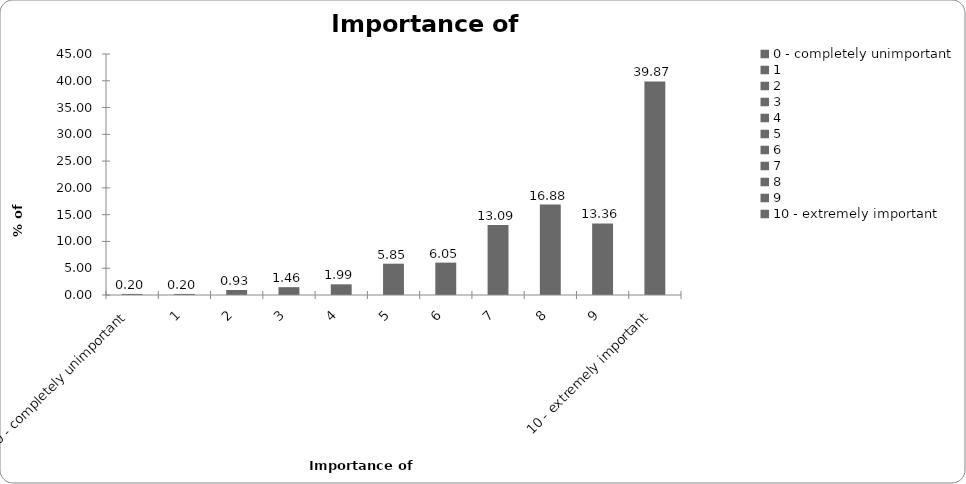
| Category | Importance of insurance |
|---|---|
| 0 - completely unimportant | 0.199 |
| 1 | 0.199 |
| 2 | 0.93 |
| 3 | 1.462 |
| 4 | 1.993 |
| 5 | 5.847 |
| 6 | 6.047 |
| 7 | 13.09 |
| 8 | 16.877 |
| 9 | 13.355 |
| 10 - extremely important | 39.867 |